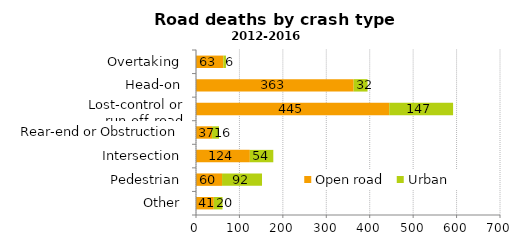
| Category | Open road | Urban |
|---|---|---|
| Overtaking | 63 | 6 |
| Head-on | 363 | 32 |
| Lost-control or run-off-road | 445 | 147 |
| Rear-end or Obstruction | 37 | 16 |
| Intersection | 124 | 54 |
| Pedestrian | 60 | 92 |
| Other | 41 | 20 |